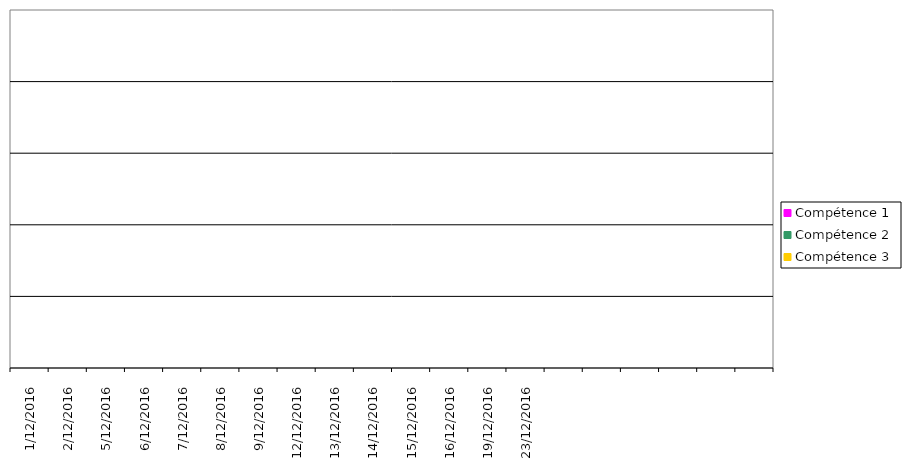
| Category | Compétence 1 | Compétence 2 | Compétence 3 |
|---|---|---|---|
| 1/12/2016 | 0 | 0 | 0 |
| 2/12/2016 | 0 | 0 | 0 |
| 5/12/2016 | 0 | 0 | 0 |
| 6/12/2016 | 0 | 0 | 0 |
| 7/12/2016 | 0 | 0 | 0 |
| 8/12/2016 | 0 | 0 | 0 |
| 9/12/2016 | 0 | 0 | 0 |
| 12/12/2016 | 0 | 0 | 0 |
| 13/12/2016 | 0 | 0 | 0 |
| 14/12/2016 | 0 | 0 | 0 |
| 15/12/2016 | 0 | 0 | 0 |
| 16/12/2016 | 0 | 0 | 0 |
| 19/12/2016 | 0 | 0 | 0 |
| 23/12/2016 | 0 | 0 | 0 |